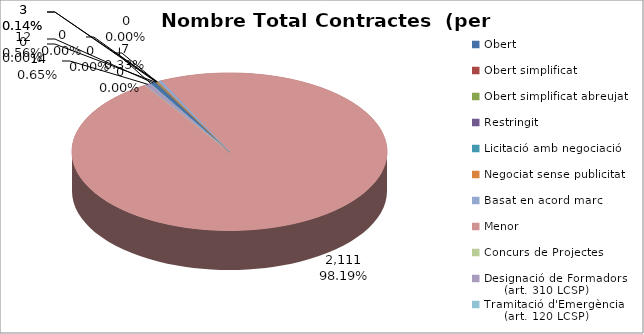
| Category | Nombre Total Contractes |
|---|---|
| Obert | 12 |
| Obert simplificat | 0 |
| Obert simplificat abreujat | 3 |
| Restringit | 0 |
| Licitació amb negociació | 0 |
| Negociat sense publicitat | 3 |
| Basat en acord marc | 7 |
| Menor | 2111 |
| Concurs de Projectes | 0 |
| Designació de Formadors
     (art. 310 LCSP) | 14 |
| Tramitació d'Emergència
     (art. 120 LCSP) | 0 |